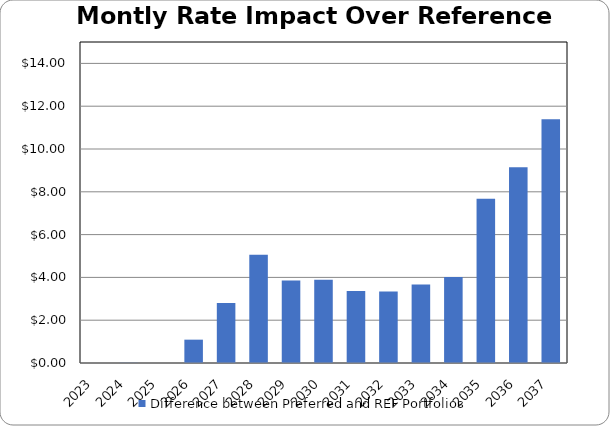
| Category | Difference between Preferred and REF Portfolios |
|---|---|
| 2023.0 | 0 |
| 2024.0 | 0.011 |
| 2025.0 | 0 |
| 2026.0 | 1.091 |
| 2027.0 | 2.808 |
| 2028.0 | 5.056 |
| 2029.0 | 3.856 |
| 2030.0 | 3.891 |
| 2031.0 | 3.363 |
| 2032.0 | 3.342 |
| 2033.0 | 3.671 |
| 2034.0 | 4.022 |
| 2035.0 | 7.678 |
| 2036.0 | 9.147 |
| 2037.0 | 11.396 |